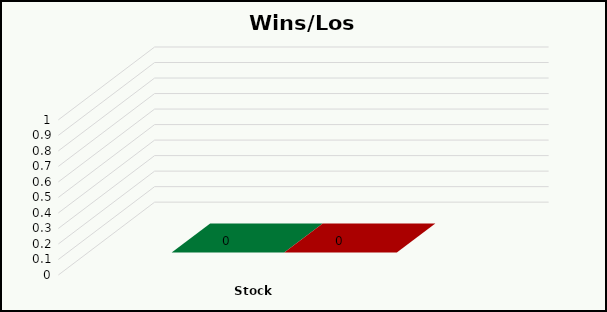
| Category | Series 1 | Series 2 |
|---|---|---|
| Stock | 0 | 0 |